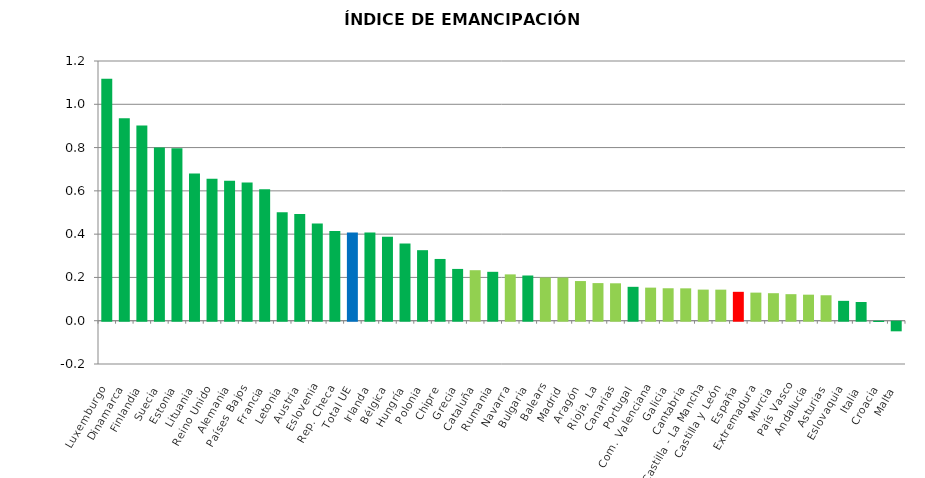
| Category | Series 0 |
|---|---|
| Luxemburgo | 1.118 |
| Dinamarca | 0.936 |
| Finlandia | 0.902 |
| Suecia | 0.801 |
| Estonia | 0.797 |
| Lituania | 0.68 |
| Reino Unido | 0.656 |
| Alemania | 0.647 |
| Países Bajos | 0.639 |
| Francia | 0.607 |
| Letonia | 0.501 |
| Austria | 0.493 |
| Eslovenia | 0.449 |
| Rep. Checa | 0.415 |
| Total UE | 0.408 |
| Irlanda | 0.408 |
| Bélgica | 0.388 |
| Hungría | 0.357 |
| Polonia | 0.326 |
| Chipre | 0.285 |
| Grecia | 0.239 |
| Cataluña | 0.233 |
| Rumania | 0.226 |
| Navarra | 0.214 |
| Bulgaria | 0.209 |
| Balears | 0.2 |
| Madrid | 0.2 |
| Aragón | 0.183 |
| Rioja, La | 0.174 |
| Canarias | 0.173 |
| Portugal | 0.157 |
| Com. Valenciana | 0.153 |
| Galicia | 0.15 |
| Cantabria | 0.15 |
| Castilla - La Mancha | 0.144 |
| Castilla y León | 0.144 |
| España | 0.134 |
| Extremadura | 0.13 |
| Murcia | 0.127 |
| País Vasco | 0.123 |
| Andalucía | 0.12 |
| Asturias | 0.118 |
| Eslovaquia | 0.092 |
| Italia | 0.086 |
| Croacia | -0.001 |
| Malta | -0.044 |